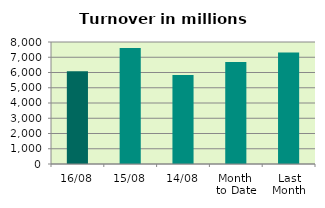
| Category | Series 0 |
|---|---|
| 16/08 | 6088.86 |
| 15/08 | 7613.323 |
| 14/08 | 5828.429 |
| Month 
to Date | 6691.169 |
| Last
Month | 7313.522 |